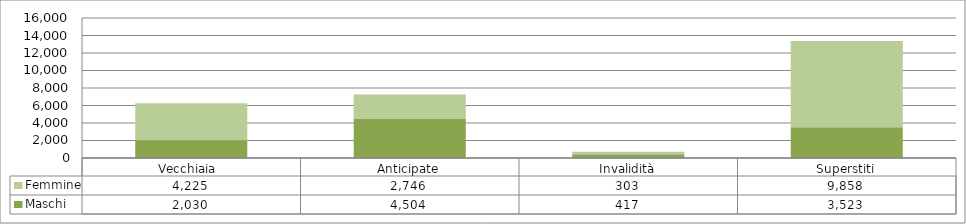
| Category | Maschi | Femmine |
|---|---|---|
| Vecchiaia  | 2030 | 4225 |
| Anticipate | 4504 | 2746 |
| Invalidità | 417 | 303 |
| Superstiti | 3523 | 9858 |